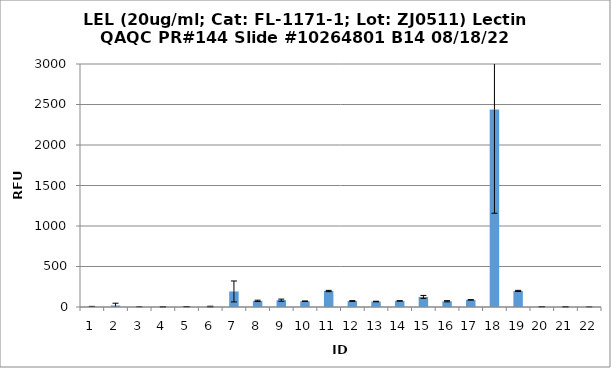
| Category | Series 0 |
|---|---|
| 0 | 3.5 |
| 1 | 19.25 |
| 2 | 0 |
| 3 | 2.25 |
| 4 | 4 |
| 5 | 5.25 |
| 6 | 192 |
| 7 | 75.5 |
| 8 | 84.5 |
| 9 | 71.75 |
| 10 | 197.5 |
| 11 | 73.75 |
| 12 | 67.75 |
| 13 | 75.25 |
| 14 | 124.75 |
| 15 | 71 |
| 16 | 87.75 |
| 17 | 2438.25 |
| 18 | 198.75 |
| 19 | 3.5 |
| 20 | 2.5 |
| 21 | 0.5 |